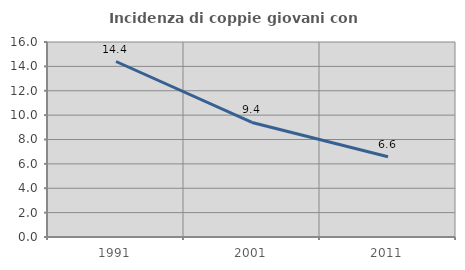
| Category | Incidenza di coppie giovani con figli |
|---|---|
| 1991.0 | 14.4 |
| 2001.0 | 9.399 |
| 2011.0 | 6.589 |